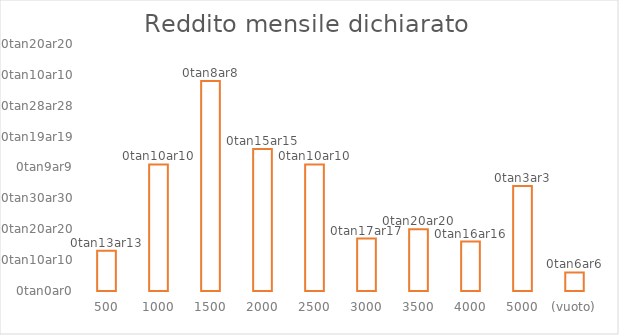
| Category | Totale |
|---|---|
| 500 | 13 |
| 1000 | 41 |
| 1500 | 68 |
| 2000 | 46 |
| 2500 | 41 |
| 3000 | 17 |
| 3500 | 20 |
| 4000 | 16 |
| 5000 | 34 |
| (vuoto) | 6 |